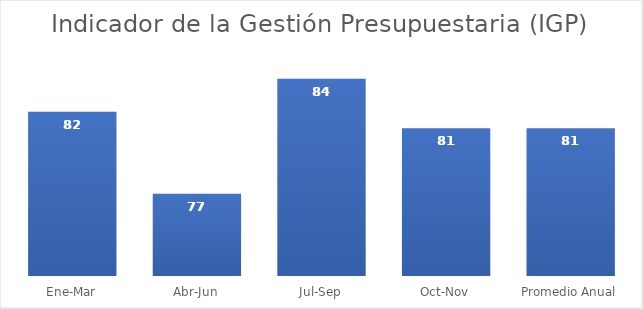
| Category | % |
|---|---|
| Ene-Mar | 82 |
| Abr-Jun | 77 |
| Jul-Sep | 84 |
| Oct-Nov | 81 |
| Promedio Anual | 81 |